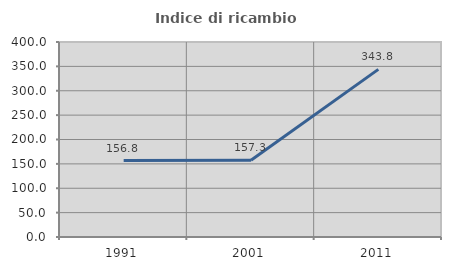
| Category | Indice di ricambio occupazionale  |
|---|---|
| 1991.0 | 156.842 |
| 2001.0 | 157.282 |
| 2011.0 | 343.836 |